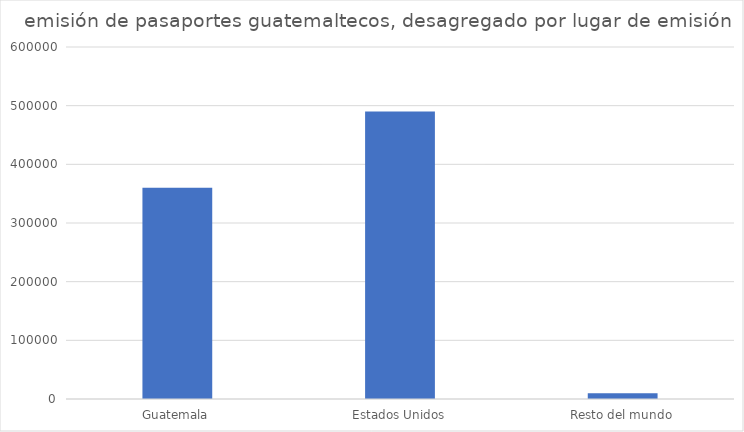
| Category | cantidad |
|---|---|
| Guatemala | 360000 |
| Estados Unidos | 490000 |
| Resto del mundo | 10000 |